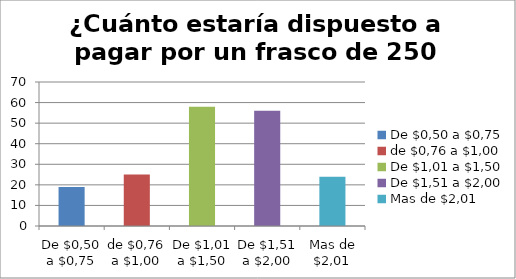
| Category | ¿Cuánto estaría dispuesto a pagar por un frasco de 250 ml? |
|---|---|
| De $0,50 a $0,75 | 19 |
| de $0,76 a $1,00 | 25 |
| De $1,01 a $1,50 | 58 |
| De $1,51 a $2,00 | 56 |
| Mas de $2,01 | 24 |